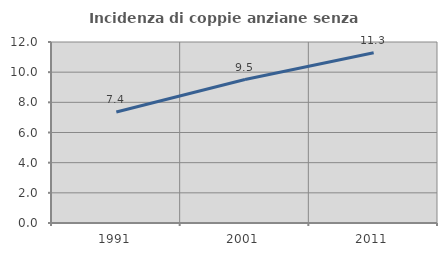
| Category | Incidenza di coppie anziane senza figli  |
|---|---|
| 1991.0 | 7.358 |
| 2001.0 | 9.509 |
| 2011.0 | 11.285 |